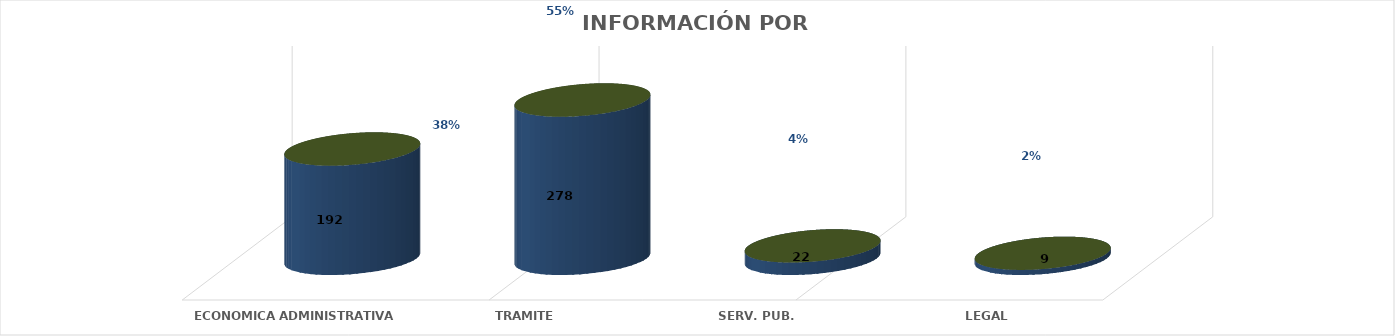
| Category | Series 0 | Series 1 | Series 2 | Series 3 | Series 4 |
|---|---|---|---|---|---|
| ECONOMICA ADMINISTRATIVA |  |  |  | 192 | 0.383 |
| TRAMITE |  |  |  | 278 | 0.555 |
| SERV. PUB. |  |  |  | 22 | 0.044 |
| LEGAL |  |  |  | 9 | 0.018 |